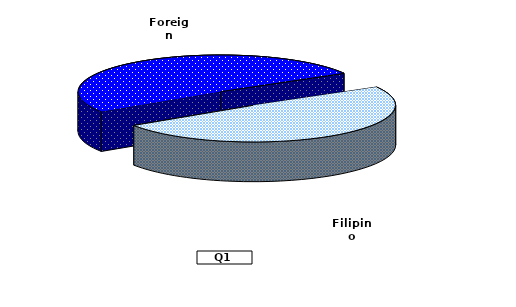
| Category | Series 0 |
|---|---|
| Filipino | 49.109 |
| Foreign | 50.891 |